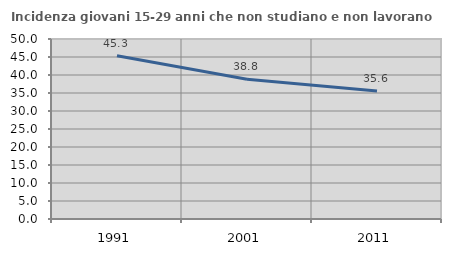
| Category | Incidenza giovani 15-29 anni che non studiano e non lavorano  |
|---|---|
| 1991.0 | 45.32 |
| 2001.0 | 38.816 |
| 2011.0 | 35.577 |